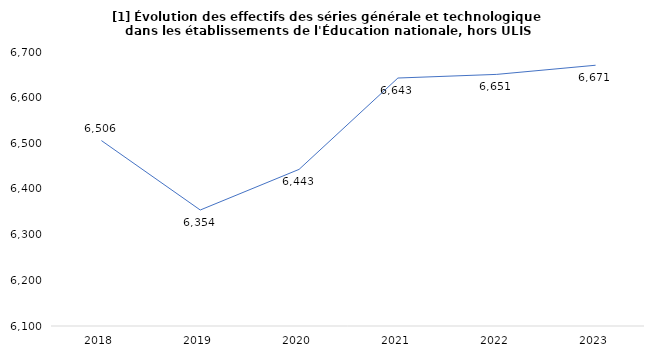
| Category | Nombre d'élèves |
|---|---|
| 2018 | 6506 |
| 2019 | 6354 |
| 2020 | 6443 |
| 2021 | 6643 |
| 2022 | 6651 |
| 2023 | 6671 |